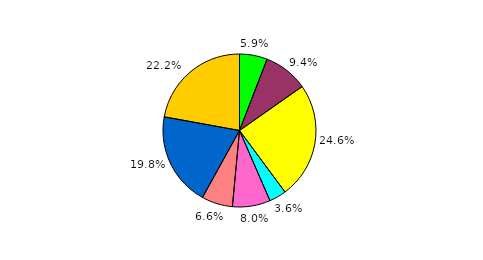
| Category | Series 0 |
|---|---|
| 0 | 5.872 |
| 1 | 9.396 |
| 2 | 24.59 |
| 3 | 3.621 |
| 4 | 8.001 |
| 5 | 6.557 |
| 6 | 19.819 |
| 7 | 22.143 |